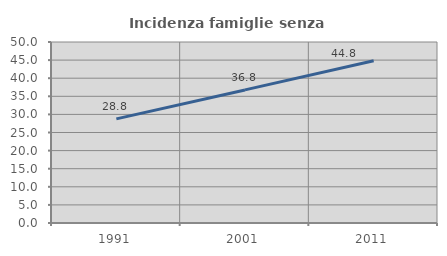
| Category | Incidenza famiglie senza nuclei |
|---|---|
| 1991.0 | 28.767 |
| 2001.0 | 36.765 |
| 2011.0 | 44.8 |